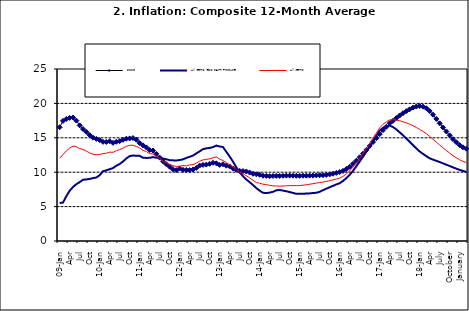
| Category | Food | All Items less Farm Produce | All Items |
|---|---|---|---|
| 09-Jan | 16.536 | 5.519 | 12.032 |
| Feb | 17.454 | 5.591 | 12.567 |
| Mar | 17.742 | 6.51 | 13.101 |
| Apr | 17.89 | 7.302 | 13.51 |
| May | 17.949 | 7.847 | 13.787 |
| June | 17.498 | 8.259 | 13.694 |
| Jul | 16.808 | 8.554 | 13.437 |
| Aug | 16.278 | 8.906 | 13.307 |
| Sep | 15.859 | 8.942 | 13.065 |
| Oct | 15.396 | 9.024 | 12.803 |
| Nov | 15.018 | 9.143 | 12.609 |
| Dec | 14.841 | 9.226 | 12.538 |
| 10-Jan | 14.668 | 9.567 | 12.586 |
| Feb | 14.411 | 10.138 | 12.7 |
| Mar | 14.395 | 10.269 | 12.757 |
| Apr | 14.489 | 10.444 | 12.915 |
| May | 14.266 | 10.597 | 12.893 |
| Jun | 14.424 | 10.948 | 13.132 |
| Jul | 14.514 | 11.193 | 13.284 |
| Aug | 14.706 | 11.549 | 13.5 |
| Sep | 14.872 | 11.997 | 13.764 |
| Oct | 14.906 | 12.345 | 13.908 |
| Nov | 14.967 | 12.423 | 13.928 |
| Dec | 14.723 | 12.383 | 13.74 |
| 11-Jan | 14.233 | 12.385 | 13.542 |
| Feb | 13.903 | 12.099 | 13.161 |
| Mar | 13.606 | 12.077 | 13.001 |
| Apr | 13.227 | 12.088 | 12.694 |
| May | 13.152 | 12.198 | 12.648 |
| Jun | 12.654 | 12.1 | 12.321 |
| Jul | 12.118 | 12.109 | 12.009 |
| Aug | 11.575 | 11.98 | 11.635 |
| Sep | 11.155 | 11.877 | 11.363 |
| Oct | 10.797 | 11.746 | 11.13 |
| Nov | 10.422 | 11.721 | 10.952 |
| Dec | 10.298 | 11.706 | 10.826 |
| 12-Jan | 10.538 | 11.765 | 10.886 |
| 12-Feb | 10.336 | 11.872 | 10.955 |
| 12-Mar | 10.325 | 12.075 | 10.914 |
| Apr | 10.304 | 12.242 | 11.054 |
| May | 10.387 | 12.419 | 11.096 |
| Jun | 10.617 | 12.732 | 11.32 |
| Jul | 10.963 | 13.032 | 11.599 |
| Aug | 11.056 | 13.349 | 11.791 |
| Sep | 11.104 | 13.467 | 11.859 |
| Oct | 11.216 | 13.525 | 11.948 |
| Nov | 11.372 | 13.649 | 12.091 |
| Dec | 11.296 | 13.873 | 12.224 |
| 13-Jan | 11.055 | 13.737 | 11.908 |
| Feb | 11.153 | 13.657 | 11.703 |
| Mar | 10.951 | 12.963 | 11.394 |
| Apr | 10.844 | 12.281 | 11.072 |
| May | 10.548 | 11.531 | 10.761 |
| Jun | 10.352 | 10.704 | 10.383 |
| Jul | 10.186 | 10.005 | 10.047 |
| Aug | 10.168 | 9.4 | 9.761 |
| Sep | 10.105 | 8.939 | 9.486 |
| Oct | 9.955 | 8.553 | 9.167 |
| Nov | 9.774 | 8.136 | 8.815 |
| Dec | 9.695 | 7.691 | 8.496 |
| 14-Jan | 9.626 | 7.317 | 8.408 |
| Feb | 9.484 | 7.005 | 8.257 |
| Mar | 9.464 | 6.976 | 8.19 |
| Apr | 9.416 | 7.03 | 8.092 |
| May | 9.448 | 7.151 | 8.012 |
| Jun | 9.464 | 7.369 | 7.998 |
| Jul | 9.459 | 7.411 | 7.968 |
| Aug | 9.481 | 7.325 | 7.996 |
| Sep | 9.501 | 7.228 | 8.027 |
| Oct | 9.508 | 7.116 | 8.047 |
| Nov | 9.492 | 6.991 | 8.046 |
| Dec | 9.481 | 6.854 | 8.047 |
| 15-Jan | 9.475 | 6.865 | 8.063 |
| Feb | 9.486 | 6.852 | 8.117 |
| Mar | 9.495 | 6.905 | 8.176 |
| Apr | 9.501 | 6.922 | 8.243 |
| May | 9.51 | 6.975 | 8.331 |
| Jun | 9.535 | 7.006 | 8.417 |
| Jul | 9.552 | 7.154 | 8.497 |
| Aug | 9.571 | 7.384 | 8.566 |
| Sep | 9.614 | 7.605 | 8.658 |
| Oct | 9.68 | 7.812 | 8.76 |
| Nov | 9.778 | 8.016 | 8.879 |
| Dec | 9.898 | 8.222 | 9.009 |
| 16-Jan | 10.017 | 8.391 | 9.13 |
| Feb | 10.184 | 8.732 | 9.386 |
| Mar | 10.471 | 9.132 | 9.751 |
| Apr | 10.786 | 9.614 | 10.182 |
| May | 11.221 | 10.196 | 10.746 |
| Jun | 11.672 | 10.864 | 11.372 |
| Jul | 12.162 | 11.553 | 12.045 |
| Aug | 12.696 | 12.247 | 12.744 |
| Sep | 13.238 | 12.98 | 13.454 |
| Oct | 13.817 | 13.757 | 14.206 |
| Nov | 14.386 | 14.542 | 14.958 |
| Dec | 14.946 | 15.307 | 15.697 |
| 17-Jan | 15.536 | 16.042 | 16.441 |
| Feb | 16.127 | 16.436 | 16.958 |
| Mar | 16.598 | 16.682 | 17.315 |
| Apr | 17.106 | 16.772 | 17.591 |
| May | 17.477 | 16.567 | 17.628 |
| Jun | 17.868 | 16.219 | 17.578 |
| Jul | 18.247 | 15.798 | 17.475 |
| Aug | 18.569 | 15.372 | 17.331 |
| Sep | 18.876 | 14.903 | 17.17 |
| Oct | 19.14 | 14.415 | 16.968 |
| Nov | 19.392 | 13.93 | 16.76 |
| Dec | 19.546 | 13.458 | 16.502 |
| 18-Jan | 19.621 | 13.01 | 16.215 |
| Feb | 19.521 | 12.668 | 15.93 |
| Mar | 19.294 | 12.33 | 15.599 |
| Apr | 18.886 | 12.021 | 15.196 |
| May | 18.359 | 11.828 | 14.793 |
| June | 17.745 | 11.651 | 14.371 |
| July | 17.102 | 11.478 | 13.95 |
| August | 16.501 | 11.285 | 13.546 |
| September | 15.923 | 11.092 | 13.157 |
| October | 15.355 | 10.903 | 12.777 |
| November | 14.802 | 10.703 | 12.406 |
| December | 14.348 | 10.514 | 12.095 |
| January | 13.934 | 10.339 | 11.801 |
| February | 13.62 | 10.185 | 11.564 |
| March | 13.42 | 10.044 | 11.401 |